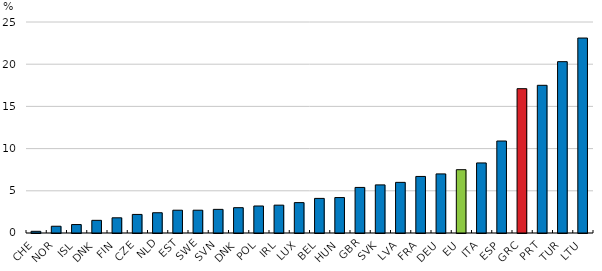
| Category | 2020 or latest available |
|---|---|
| CHE | 0.2 |
| NOR | 0.8 |
| ISL | 1 |
| DNK | 1.5 |
| FIN | 1.8 |
| CZE | 2.2 |
| NLD | 2.4 |
| EST | 2.7 |
| SWE | 2.7 |
| SVN | 2.8 |
| DNK | 3 |
| POL | 3.2 |
| IRL | 3.3 |
| LUX | 3.6 |
| BEL | 4.1 |
| HUN | 4.2 |
| GBR | 5.4 |
| SVK | 5.7 |
| LVA | 6 |
| FRA | 6.7 |
| DEU | 7 |
| EU | 7.5 |
| ITA | 8.3 |
| ESP | 10.9 |
| GRC | 17.1 |
| PRT | 17.5 |
| TUR | 20.3 |
| LTU | 23.1 |